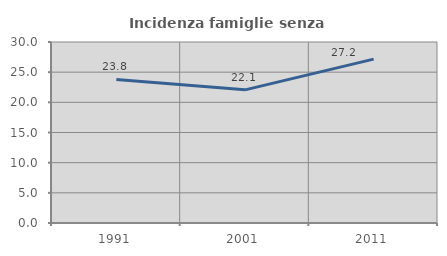
| Category | Incidenza famiglie senza nuclei |
|---|---|
| 1991.0 | 23.794 |
| 2001.0 | 22.066 |
| 2011.0 | 27.16 |